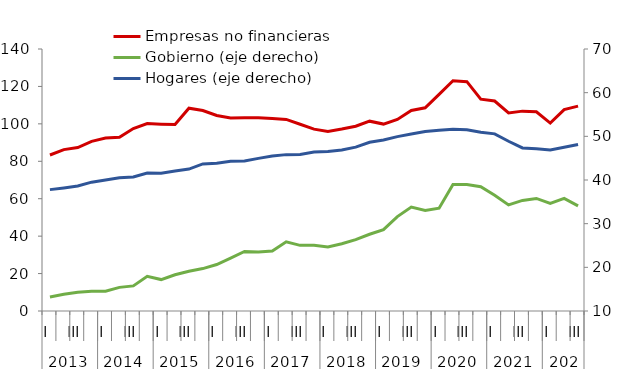
| Category | Empresas no financieras  |
|---|---|
| 0 | 83.37 |
| 1 | 86.225 |
| 2 | 87.367 |
| 3 | 90.656 |
| 4 | 92.436 |
| 5 | 92.789 |
| 6 | 97.526 |
| 7 | 100.137 |
| 8 | 99.842 |
| 9 | 99.634 |
| 10 | 108.349 |
| 11 | 107.148 |
| 12 | 104.451 |
| 13 | 103.113 |
| 14 | 103.211 |
| 15 | 103.226 |
| 16 | 102.827 |
| 17 | 102.353 |
| 18 | 99.792 |
| 19 | 97.192 |
| 20 | 95.915 |
| 21 | 97.239 |
| 22 | 98.733 |
| 23 | 101.441 |
| 24 | 99.878 |
| 25 | 102.347 |
| 26 | 107.123 |
| 27 | 108.591 |
| 28 | 115.761 |
| 29 | 123.073 |
| 30 | 122.535 |
| 31 | 113.171 |
| 32 | 112.199 |
| 33 | 105.847 |
| 34 | 106.8 |
| 35 | 106.448 |
| 36 | 100.415 |
| 37 | 107.587 |
| 38 | 109.485 |